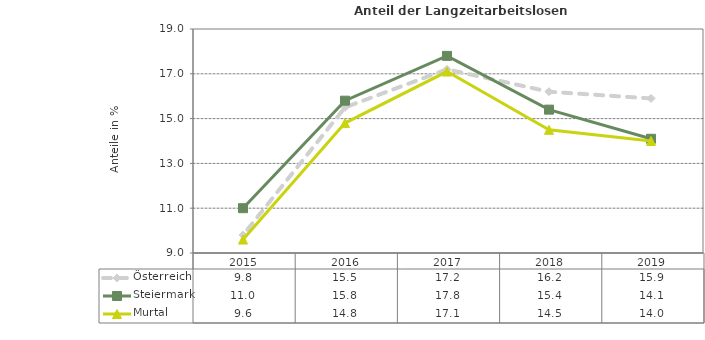
| Category | Österreich | Steiermark | Murtal |
|---|---|---|---|
| 2019.0 | 15.9 | 14.1 | 14 |
| 2018.0 | 16.2 | 15.4 | 14.5 |
| 2017.0 | 17.2 | 17.8 | 17.1 |
| 2016.0 | 15.5 | 15.8 | 14.8 |
| 2015.0 | 9.8 | 11 | 9.6 |